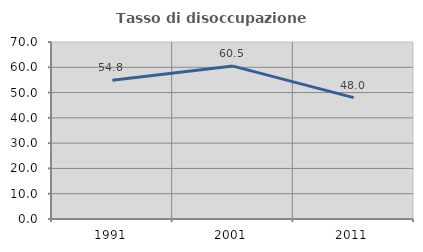
| Category | Tasso di disoccupazione giovanile  |
|---|---|
| 1991.0 | 54.839 |
| 2001.0 | 60.465 |
| 2011.0 | 48 |